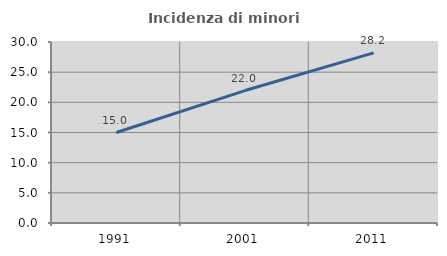
| Category | Incidenza di minori stranieri |
|---|---|
| 1991.0 | 15 |
| 2001.0 | 21.951 |
| 2011.0 | 28.194 |